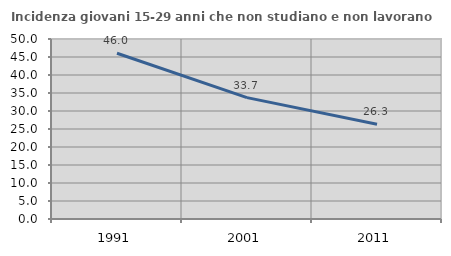
| Category | Incidenza giovani 15-29 anni che non studiano e non lavorano  |
|---|---|
| 1991.0 | 46.043 |
| 2001.0 | 33.718 |
| 2011.0 | 26.316 |